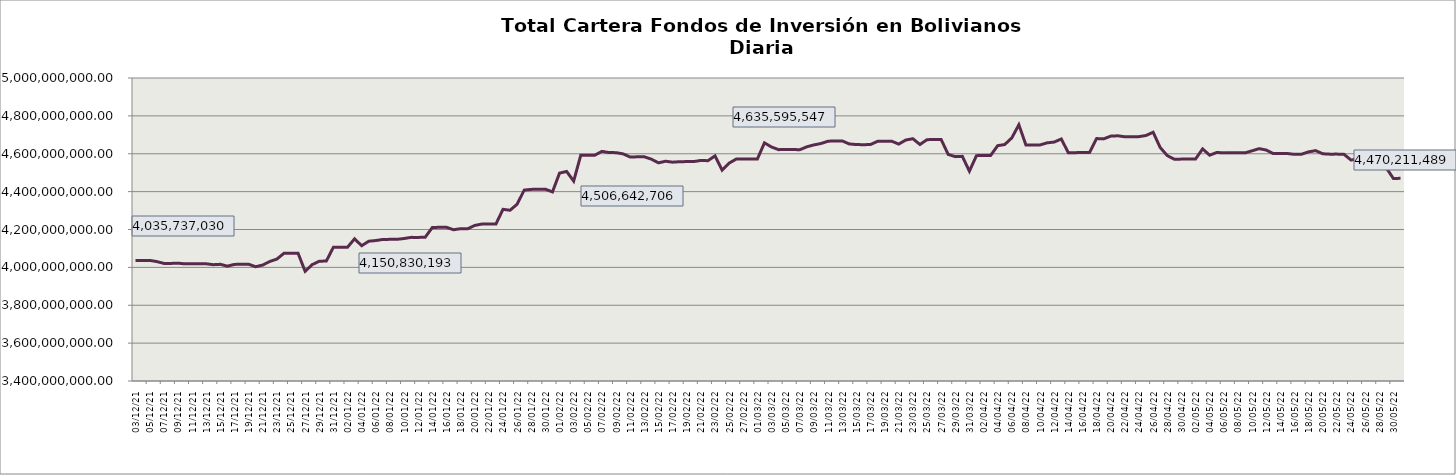
| Category | Cartera |
|---|---|
| 2021-12-03 | 4035737029.9 |
| 2021-12-04 | 4036648316.91 |
| 2021-12-05 | 4036798525.69 |
| 2021-12-06 | 4030641556.77 |
| 2021-12-07 | 4021071332.69 |
| 2021-12-08 | 4020841513.97 |
| 2021-12-09 | 4022282759.98 |
| 2021-12-10 | 4018577652.8 |
| 2021-12-11 | 4019048982.35 |
| 2021-12-12 | 4019202753.68 |
| 2021-12-13 | 4018906735.03 |
| 2021-12-14 | 4014231400.3 |
| 2021-12-15 | 4016158632.79 |
| 2021-12-16 | 4006410253.38 |
| 2021-12-17 | 4015713869.32 |
| 2021-12-18 | 4016460649.94 |
| 2021-12-19 | 4016614667.83 |
| 2021-12-20 | 4003330174.81 |
| 2021-12-21 | 4012399924.79 |
| 2021-12-22 | 4031167286.06 |
| 2021-12-23 | 4043590761.06 |
| 2021-12-24 | 4074342425.91 |
| 2021-12-25 | 4074404443.09 |
| 2021-12-26 | 4074548330.81 |
| 2021-12-27 | 3979304418.3 |
| 2021-12-28 | 4014512377.74 |
| 2021-12-29 | 4032348655.92 |
| 2021-12-30 | 4033554378.01 |
| 2021-12-31 | 4106328109.97 |
| 2022-01-01 | 4106463760.39 |
| 2022-01-02 | 4106625539.49 |
| 2022-01-03 | 4150830193.37 |
| 2022-01-04 | 4114259388.02 |
| 2022-01-05 | 4138084557.93 |
| 2022-01-06 | 4141622878.02 |
| 2022-01-07 | 4147468023.87 |
| 2022-01-08 | 4147940561.11 |
| 2022-01-09 | 4148083349.28 |
| 2022-01-10 | 4152364460.8 |
| 2022-01-11 | 4158475365.58 |
| 2022-01-12 | 4158113511.88 |
| 2022-01-13 | 4159573411.86 |
| 2022-01-14 | 4210721310.99 |
| 2022-01-15 | 4211495817.5 |
| 2022-01-16 | 4211650829.5 |
| 2022-01-17 | 4198750557.25 |
| 2022-01-18 | 4204258397.77 |
| 2022-01-19 | 4203713405.21 |
| 2022-01-20 | 4221516057.45 |
| 2022-01-21 | 4228647370.78 |
| 2022-01-22 | 4228799498.1 |
| 2022-01-23 | 4228972058.38 |
| 2022-01-24 | 4306488856.99 |
| 2022-01-25 | 4301604248.16 |
| 2022-01-26 | 4333512559.4 |
| 2022-01-27 | 4408083501.1 |
| 2022-01-28 | 4411815063.3 |
| 2022-01-29 | 4412668984.11 |
| 2022-01-30 | 4412825667.73 |
| 2022-01-31 | 4398377128.72 |
| 2022-02-01 | 4497668984.41 |
| 2022-02-02 | 4506642705.82 |
| 2022-02-03 | 4455598056.07 |
| 2022-02-04 | 4591560407.27 |
| 2022-02-05 | 4592522226.91 |
| 2022-02-06 | 4592653842.81 |
| 2022-02-07 | 4612561220.33 |
| 2022-02-08 | 4606319145.76 |
| 2022-02-09 | 4605821787.61 |
| 2022-02-10 | 4599288664.12 |
| 2022-02-11 | 4582616044.25 |
| 2022-02-12 | 4583762681.64 |
| 2022-02-13 | 4583896783.33 |
| 2022-02-14 | 4571260353.56 |
| 2022-02-15 | 4552032393.44 |
| 2022-02-16 | 4560419043.39 |
| 2022-02-17 | 4555513550.51 |
| 2022-02-18 | 4557960055.09 |
| 2022-02-19 | 4558615193.96 |
| 2022-02-20 | 4558759536.31 |
| 2022-02-21 | 4564700630.98 |
| 2022-02-22 | 4563390005.55 |
| 2022-02-23 | 4588702451.83 |
| 2022-02-24 | 4513579397.97 |
| 2022-02-25 | 4550617633.55 |
| 2022-02-26 | 4571831972.65 |
| 2022-02-27 | 4571973771.7 |
| 2022-02-28 | 4572289568.05 |
| 2022-03-01 | 4572426486.59 |
| 2022-03-02 | 4657594033.25 |
| 2022-03-03 | 4635595546.87 |
| 2022-03-04 | 4621701726.94 |
| 2022-03-05 | 4622260542.95 |
| 2022-03-06 | 4622397706.07 |
| 2022-03-07 | 4621231955.84 |
| 2022-03-08 | 4636797919.3 |
| 2022-03-09 | 4646776942.9 |
| 2022-03-10 | 4654148680.09 |
| 2022-03-11 | 4666273492.91 |
| 2022-03-12 | 4667677300.48 |
| 2022-03-13 | 4667822150.1 |
| 2022-03-14 | 4651812941.75 |
| 2022-03-15 | 4648636795.27 |
| 2022-03-16 | 4647785449.97 |
| 2022-03-17 | 4648711611.4 |
| 2022-03-18 | 4665447231.95 |
| 2022-03-19 | 4666136048.45 |
| 2022-03-20 | 4666283534.81 |
| 2022-03-21 | 4651096941.21 |
| 2022-03-22 | 4672463473.92 |
| 2022-03-23 | 4679444608.97 |
| 2022-03-24 | 4648824645.59 |
| 2022-03-25 | 4674372379.26 |
| 2022-03-26 | 4675225293.58 |
| 2022-03-27 | 4675375973.02 |
| 2022-03-28 | 4596498777.68 |
| 2022-03-29 | 4584701104.16 |
| 2022-03-30 | 4586342587.13 |
| 2022-03-31 | 4507894398.03 |
| 2022-04-01 | 4589993699.62 |
| 2022-04-02 | 4590745277.04 |
| 2022-04-03 | 4590901549.43 |
| 2022-04-04 | 4642640609.99 |
| 2022-04-05 | 4648726740.84 |
| 2022-04-06 | 4683740570.05 |
| 2022-04-07 | 4752997629.66 |
| 2022-04-08 | 4646100090.15 |
| 2022-04-09 | 4646463764.85 |
| 2022-04-10 | 4646475857.6 |
| 2022-04-11 | 4657681794.17 |
| 2022-04-12 | 4661713102.1 |
| 2022-04-13 | 4677964118.95 |
| 2022-04-14 | 4605586832.35 |
| 2022-04-15 | 4605742384.73 |
| 2022-04-16 | 4606655967.12 |
| 2022-04-17 | 4606817467.55 |
| 2022-04-18 | 4680250873.43 |
| 2022-04-19 | 4678493893.19 |
| 2022-04-20 | 4692994121.63 |
| 2022-04-21 | 4694734940.33 |
| 2022-04-22 | 4689502492.55 |
| 2022-04-23 | 4690254352.31 |
| 2022-04-24 | 4690414261.03 |
| 2022-04-25 | 4696542999.17 |
| 2022-04-26 | 4713456084.29 |
| 2022-04-27 | 4632808500.91 |
| 2022-04-28 | 4590246108.79 |
| 2022-04-29 | 4570718537.21 |
| 2022-04-30 | 4571700436.96 |
| 2022-05-01 | 4571871406.82 |
| 2022-05-02 | 4572050362.49 |
| 2022-05-03 | 4625640695.54 |
| 2022-05-04 | 4592417810.11 |
| 2022-05-05 | 4606790264.34 |
| 2022-05-06 | 4604567901.92 |
| 2022-05-07 | 4605216962.1 |
| 2022-05-08 | 4605385406.24 |
| 2022-05-09 | 4604605494.28 |
| 2022-05-10 | 4615449266.24 |
| 2022-05-11 | 4626877138.28 |
| 2022-05-12 | 4619671028.17 |
| 2022-05-13 | 4600681221.4 |
| 2022-05-14 | 4601130818.67 |
| 2022-05-15 | 4601313840.75 |
| 2022-05-16 | 4596731922.27 |
| 2022-05-17 | 4597783010.34 |
| 2022-05-18 | 4609981199.59 |
| 2022-05-19 | 4616519080.93 |
| 2022-05-20 | 4599852201.92 |
| 2022-05-21 | 4597887412.56 |
| 2022-05-22 | 4598081596.87 |
| 2022-05-23 | 4597156732.32 |
| 2022-05-24 | 4566840794.9 |
| 2022-05-25 | 4573465000.29 |
| 2022-05-26 | 4548773601.7 |
| 2022-05-27 | 4522424963.66 |
| 2022-05-28 | 4524542594.19 |
| 2022-05-29 | 4524722120.6 |
| 2022-05-30 | 4469375422.19 |
| 2022-05-31 | 4470211488.72 |